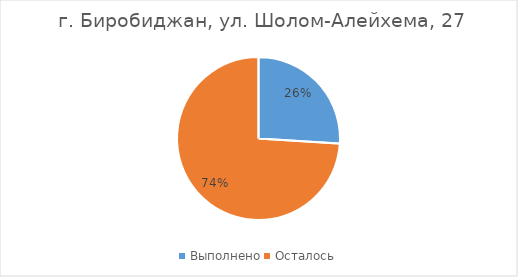
| Category |  г. Биробиджан, ул. Шолом-Алейхема, 27 |
|---|---|
| Выполнено | 0.26 |
| Осталось | 0.74 |